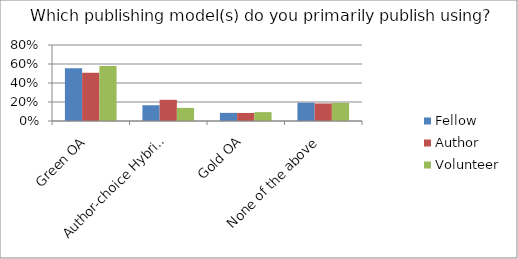
| Category | Fellow | Author | Volunteer |
|---|---|---|---|
| Green OA | 0.556 | 0.508 | 0.578 |
| Author-choice Hybrid OA | 0.166 | 0.223 | 0.138 |
| Gold OA | 0.086 | 0.085 | 0.093 |
| None of the above | 0.193 | 0.185 | 0.19 |